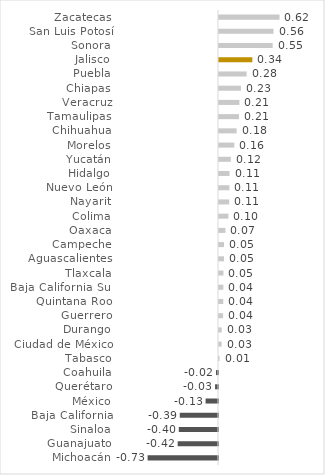
| Category | Series 0 |
|---|---|
| Michoacán | -0.726 |
| Guanajuato | -0.416 |
| Sinaloa | -0.404 |
| Baja California | -0.394 |
| México | -0.128 |
| Querétaro | -0.03 |
| Coahuila | -0.021 |
| Tabasco | 0.006 |
| Ciudad de México | 0.027 |
| Durango | 0.028 |
| Guerrero | 0.042 |
| Quintana Roo | 0.044 |
| Baja California Sur | 0.045 |
| Tlaxcala | 0.046 |
| Aguascalientes | 0.051 |
| Campeche | 0.052 |
| Oaxaca | 0.066 |
| Colima | 0.097 |
| Nayarit | 0.105 |
| Nuevo León | 0.108 |
| Hidalgo | 0.109 |
| Yucatán | 0.122 |
| Morelos | 0.158 |
| Chihuahua | 0.181 |
| Tamaulipas | 0.206 |
| Veracruz | 0.211 |
| Chiapas | 0.226 |
| Puebla | 0.284 |
| Jalisco | 0.344 |
| Sonora | 0.554 |
| San Luis Potosí | 0.562 |
| Zacatecas | 0.624 |